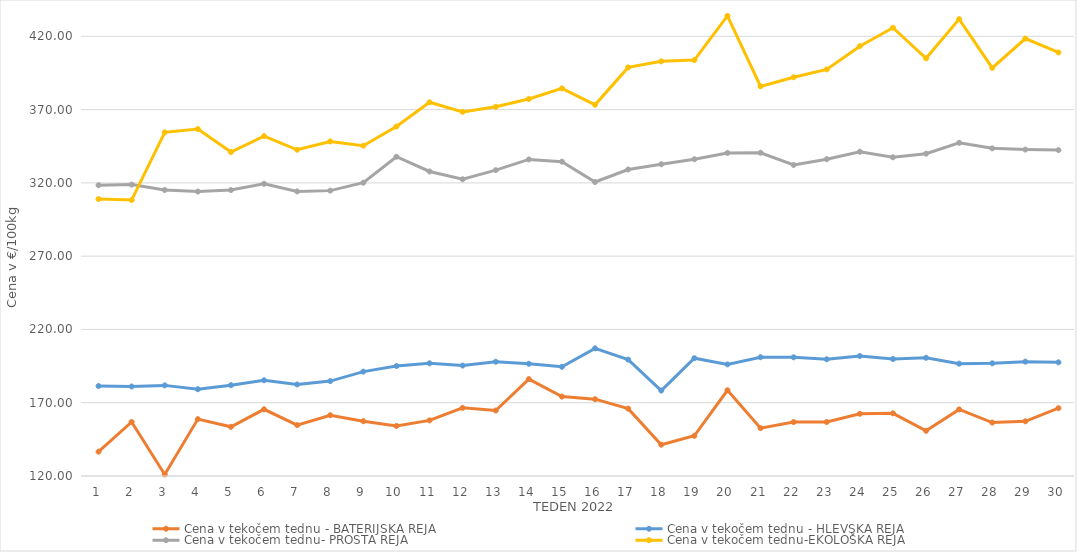
| Category | Cena v tekočem tednu - BATERIJSKA REJA | Cena v tekočem tednu - HLEVSKA REJA | Cena v tekočem tednu- PROSTA REJA | Cena v tekočem tednu-EKOLOŠKA REJA |
|---|---|---|---|---|
| 1.0 | 136.59 | 181.38 | 318.4 | 308.97 |
| 2.0 | 156.88 | 181.07 | 318.82 | 308.28 |
| 3.0 | 121.07 | 181.83 | 315.14 | 354.48 |
| 4.0 | 158.82 | 179.22 | 314.08 | 356.72 |
| 5.0 | 153.55 | 181.96 | 315.1 | 341.03 |
| 6.0 | 165.51 | 185.31 | 319.38 | 351.9 |
| 7.0 | 154.74 | 182.45 | 314.16 | 342.59 |
| 8.0 | 161.48 | 184.77 | 314.71 | 348.28 |
| 9.0 | 157.38 | 191.21 | 320.1 | 345.35 |
| 10.0 | 154.16 | 195.04 | 337.83 | 358.45 |
| 11.0 | 157.96 | 196.88 | 327.79 | 375 |
| 12.0 | 166.49 | 195.36 | 322.46 | 368.45 |
| 13.0 | 164.66 | 197.95 | 328.67 | 371.9 |
| 14.0 | 186.11 | 196.59 | 336.02 | 377.24 |
| 15.0 | 174.18 | 194.49 | 334.46 | 384.48 |
| 16.0 | 172.42 | 207.1 | 320.58 | 373.28 |
| 17.0 | 165.96 | 199.41 | 329.11 | 398.79 |
| 18.0 | 141.36 | 178.29 | 332.71 | 402.93 |
| 19.0 | 147.43 | 200.37 | 336.11 | 403.79 |
| 20.0 | 178.51 | 196.16 | 340.4 | 433.97 |
| 21.0 | 152.67 | 201.05 | 340.55 | 385.86 |
| 22.0 | 156.8 | 200.98 | 332.23 | 392.07 |
| 23.0 | 156.84 | 199.63 | 336.16 | 397.41 |
| 24.0 | 162.44 | 201.86 | 341.24 | 413.28 |
| 25.0 | 162.78 | 199.81 | 337.48 | 425.86 |
| 26.0 | 150.82 | 200.65 | 339.9 | 405 |
| 27.0 | 165.45 | 196.64 | 347.3 | 431.72 |
| 28.0 | 156.46 | 196.88 | 343.56 | 398.45 |
| 29.0 | 157.31 | 198.03 | 342.71 | 418.45 |
| 30.0 | 166.29 | 197.55 | 342.35 | 408.97 |